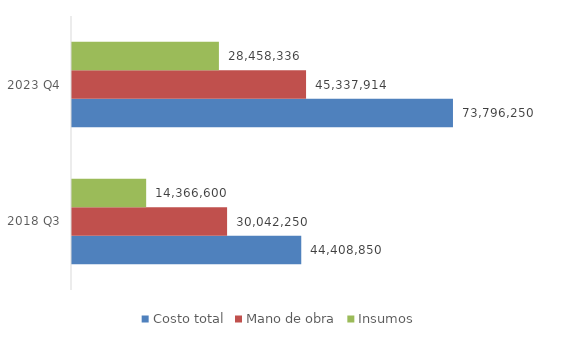
| Category | Costo total | Mano de obra | Insumos |
|---|---|---|---|
| 2018 Q3 | 44408850 | 30042250 | 14366600 |
| 2023 Q4 | 73796249.631 | 45337914 | 28458335.631 |